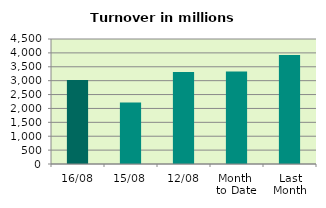
| Category | Series 0 |
|---|---|
| 16/08 | 3026.771 |
| 15/08 | 2218.209 |
| 12/08 | 3313.231 |
| Month 
to Date | 3334.315 |
| Last
Month | 3920.999 |